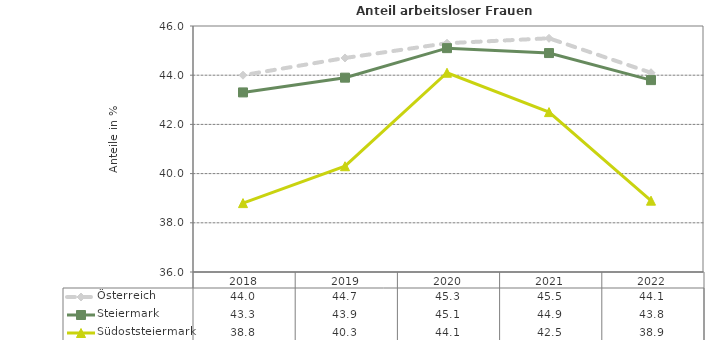
| Category | Österreich | Steiermark | Südoststeiermark |
|---|---|---|---|
| 2022.0 | 44.1 | 43.8 | 38.9 |
| 2021.0 | 45.5 | 44.9 | 42.5 |
| 2020.0 | 45.3 | 45.1 | 44.1 |
| 2019.0 | 44.7 | 43.9 | 40.3 |
| 2018.0 | 44 | 43.3 | 38.8 |